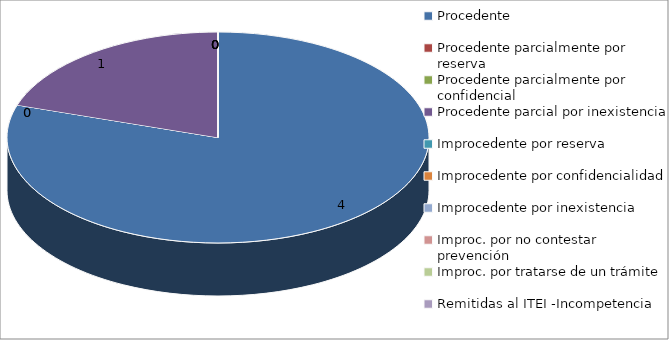
| Category | Series 0 |
|---|---|
| Procedente | 4 |
| Procedente parcialmente por reserva  | 0 |
| Procedente parcialmente por confidencial | 0 |
| Procedente parcial por inexistencia | 1 |
| Improcedente por reserva  | 0 |
| Improcedente por confidencialidad | 0 |
| Improcedente por inexistencia  | 0 |
| Improc. por no contestar prevención | 0 |
| Improc. por tratarse de un trámite  | 0 |
| Remitidas al ITEI -Incompetencia  | 0 |